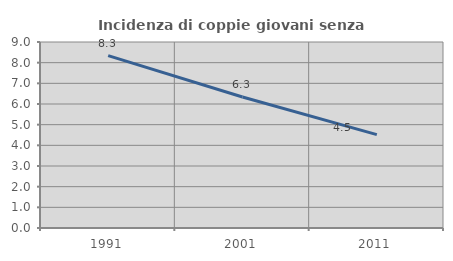
| Category | Incidenza di coppie giovani senza figli |
|---|---|
| 1991.0 | 8.341 |
| 2001.0 | 6.34 |
| 2011.0 | 4.518 |